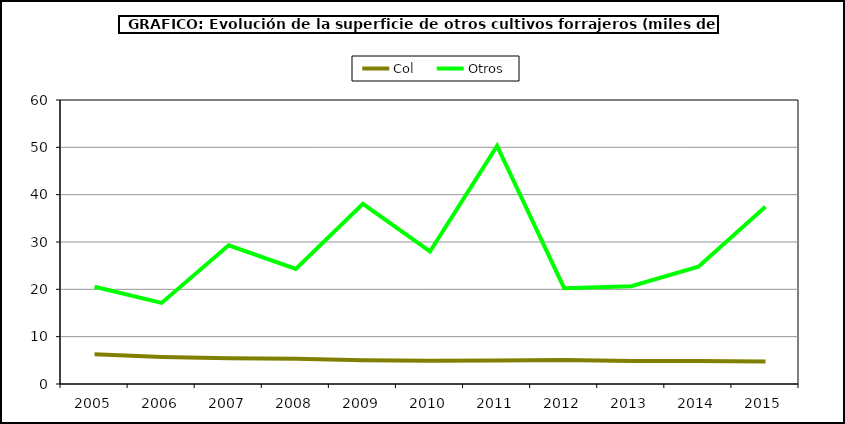
| Category | Col | Otros |
|---|---|---|
| 2005.0 | 6.305 | 20.551 |
| 2006.0 | 5.722 | 17.127 |
| 2007.0 | 5.431 | 29.302 |
| 2008.0 | 5.333 | 24.321 |
| 2009.0 | 4.996 | 38.075 |
| 2010.0 | 4.899 | 27.997 |
| 2011.0 | 4.982 | 50.317 |
| 2012.0 | 5.09 | 20.245 |
| 2013.0 | 4.865 | 20.659 |
| 2014.0 | 4.875 | 24.797 |
| 2015.0 | 4.771 | 37.464 |